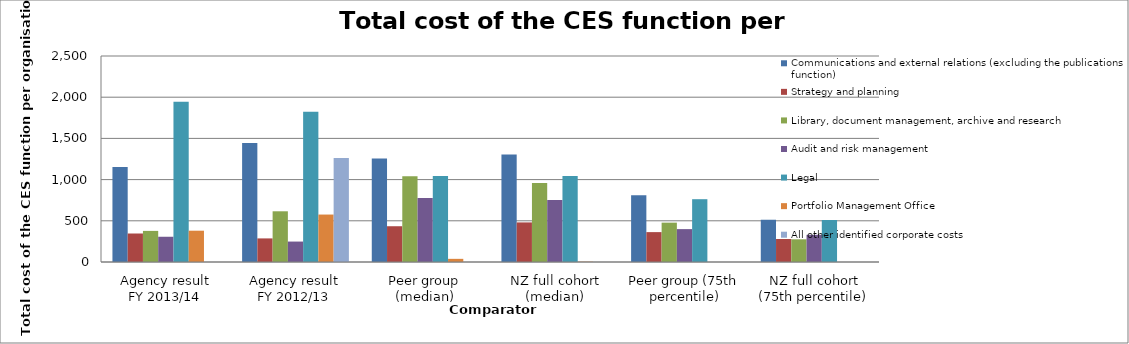
| Category | Communications and external relations (excluding the publications function) | Strategy and planning | Library, document management, archive and research | Audit and risk management | Legal | Portfolio Management Office | All other identified corporate costs |
|---|---|---|---|---|---|---|---|
| Agency result
FY 2013/14 | 1152.5 | 345.871 | 377.48 | 306.361 | 1945.147 | 379.912 | 0 |
| Agency result
FY 2012/13 | 1444.883 | 286.379 | 615.436 | 248.03 | 1824.041 | 575.85 | 1263.036 |
| Peer group (median) | 1255.271 | 434.095 | 1042.162 | 776.728 | 1042.651 | 38.284 | 0 |
| NZ full cohort (median) | 1305.758 | 480.41 | 959.186 | 752.332 | 1042.651 | 3.298 | 0 |
| Peer group (75th percentile) | 811.503 | 362.661 | 477.626 | 399.012 | 762.179 | 0 | 0 |
| NZ full cohort (75th percentile) | 512.811 | 279.24 | 275.363 | 329.715 | 509.63 | 0 | 0 |